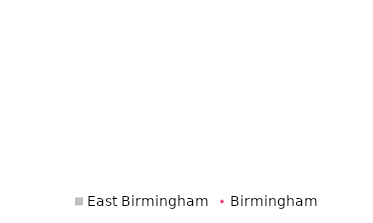
| Category | East Birmingham |
|---|---|
| 0 | 25.252 |
| 1 | -26.754 |
| 2 | -15.851 |
| 3 | -8.636 |
| 4 | -33.476 |
| 5 | 38.337 |
| 6 | -20.08 |
| 7 | 10.754 |
| 8 | 5.299 |